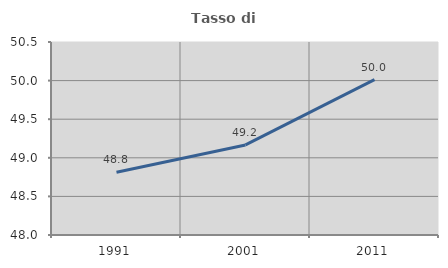
| Category | Tasso di occupazione   |
|---|---|
| 1991.0 | 48.812 |
| 2001.0 | 49.167 |
| 2011.0 | 50.012 |